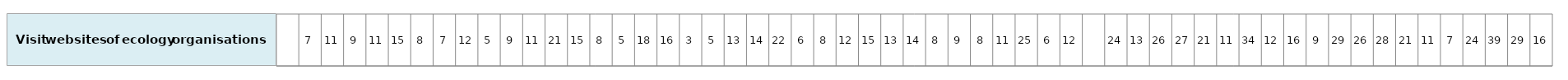
| Category | Visit web sites of ecology organisations |
|---|---|
| nan | 1 |
| 7.245875098347182 | 1 |
| 11.18343627567592 | 1 |
| 8.682918572480073 | 1 |
| 10.72838696239479 | 1 |
| 14.50429861466192 | 1 |
| 8.173970733555327 | 1 |
| 7.089383950988718 | 1 |
| 11.94867065693421 | 1 |
| 4.811144037765684 | 1 |
| 8.592290448657964 | 1 |
| 11.11689308617355 | 1 |
| 20.980258067398 | 1 |
| 14.6313656346015 | 1 |
| 7.905400830988965 | 1 |
| 4.758411914734093 | 1 |
| 18.28149017491593 | 1 |
| 16.25706887108359 | 1 |
| 2.955496339011045 | 1 |
| 5.260295611416752 | 1 |
| 12.58995848391465 | 1 |
| 14.00140527127418 | 1 |
| 22.46410628621353 | 1 |
| 6.130698752463984 | 1 |
| 8.104462102220205 | 1 |
| 12.04607804025593 | 1 |
| 14.50721029082886 | 1 |
| 13.03110169347468 | 1 |
| 13.97600409256274 | 1 |
| 8.159543746737686 | 1 |
| 9.043092686618492 | 1 |
| 7.695801298313433 | 1 |
| 10.73987890697437 | 1 |
| 25.07619219487957 | 1 |
| 6.259374375509682 | 1 |
| 11.57229810501173 | 1 |
| nan | 1 |
| 24.20185806776794 | 1 |
| 12.87774399711634 | 1 |
| 26.43184885566814 | 1 |
| 26.60388054115528 | 1 |
| 20.8368585674678 | 1 |
| 10.93883752342784 | 1 |
| 33.73370310413757 | 1 |
| 11.78985826983842 | 1 |
| 15.5535801420921 | 1 |
| 9.328445253911445 | 1 |
| 28.55142107848377 | 1 |
| 25.85535425543014 | 1 |
| 28.33046583454053 | 1 |
| 20.58509648976684 | 1 |
| 11.25953709280121 | 1 |
| 6.831350219144457 | 1 |
| 24.30866819880338 | 1 |
| 38.73984484261741 | 1 |
| 29.16443769923392 | 1 |
| 15.51272737307111 | 1 |